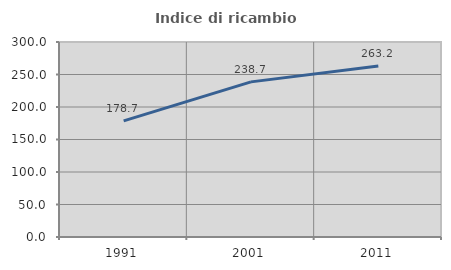
| Category | Indice di ricambio occupazionale  |
|---|---|
| 1991.0 | 178.74 |
| 2001.0 | 238.66 |
| 2011.0 | 263.203 |